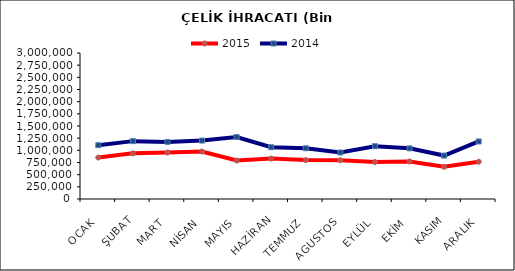
| Category | 2015 | 2014 |
|---|---|---|
| OCAK | 851959.678 | 1105472.877 |
| ŞUBAT | 937971.255 | 1189051.898 |
| MART | 954846.979 | 1173025.054 |
| NİSAN | 974773.185 | 1200585.39 |
| MAYIS | 790376.856 | 1272867.481 |
| HAZİRAN | 830201.831 | 1063909.976 |
| TEMMUZ | 799546.812 | 1042740.867 |
| AGUSTOS | 795899.897 | 955619.926 |
| EYLÜL | 759631.363 | 1084684.175 |
| EKİM | 770384.395 | 1041110.741 |
| KASIM | 662480.843 | 892211.666 |
| ARALIK | 766536.321 | 1182429.689 |